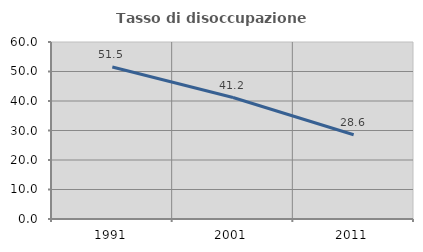
| Category | Tasso di disoccupazione giovanile  |
|---|---|
| 1991.0 | 51.515 |
| 2001.0 | 41.176 |
| 2011.0 | 28.571 |